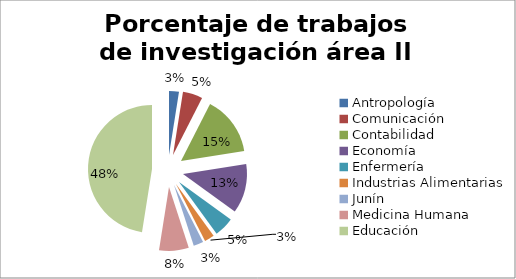
| Category | Nº |
|---|---|
| Antropología | 1 |
| Comunicación | 2 |
| Contabilidad | 6 |
| Economía | 5 |
| Enfermería | 2 |
| Industrias Alimentarias | 1 |
| Junín | 1 |
| Medicina Humana | 3 |
| Educación | 19 |